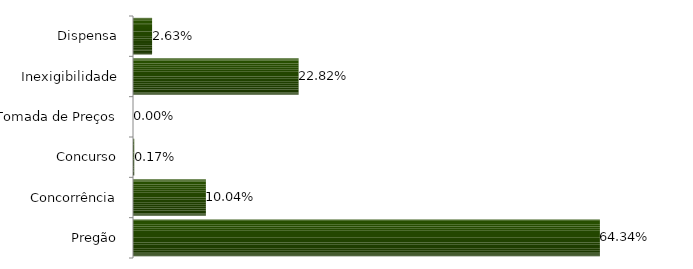
| Category | Series 0 |
|---|---|
| Pregão | 0.643 |
| Concorrência | 0.1 |
| Concurso | 0.002 |
| Tomada de Preços | 0 |
| Inexigibilidade | 0.228 |
| Dispensa | 0.026 |